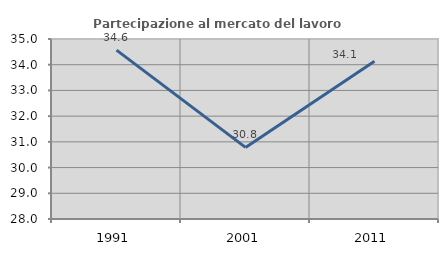
| Category | Partecipazione al mercato del lavoro  femminile |
|---|---|
| 1991.0 | 34.566 |
| 2001.0 | 30.784 |
| 2011.0 | 34.136 |